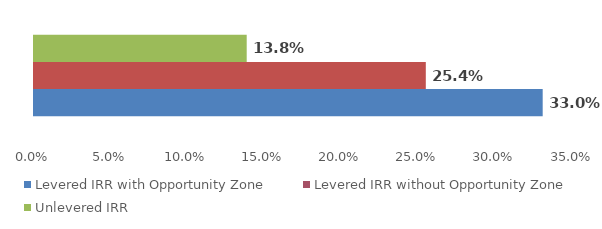
| Category | Levered IRR with Opportunity Zone | Levered IRR without Opportunity Zone | Unlevered IRR |
|---|---|---|---|
| 0 | 0.33 | 0.254 | 0.138 |